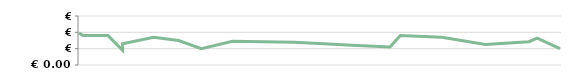
| Category | INCASSO |
|---|---|
| 2013-04-23 | 1950 |
| 2013-04-25 | 1800 |
| 2013-05-07 | 1800 |
| 2013-05-14 | 900 |
| 2013-05-14 | 1300 |
| 2013-05-29 | 1700 |
| 2013-06-10 | 1500 |
| 2013-06-21 | 1000 |
| 2013-07-06 | 1450 |
| 2013-08-05 | 1400 |
| 2013-08-19 | 1300 |
| 2013-09-04 | 1200 |
| 2013-09-20 | 1100 |
| 2013-09-25 | 1800 |
| 2013-10-15 | 1700 |
| 2013-11-05 | 1250 |
| 2013-11-26 | 1425 |
| 2013-11-30 | 1650 |
| 2013-12-11 | 1000 |